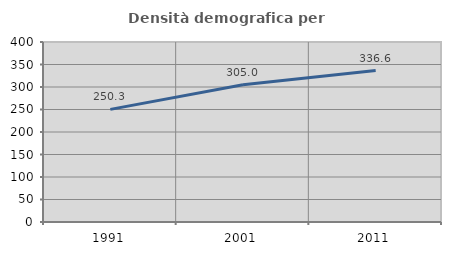
| Category | Densità demografica |
|---|---|
| 1991.0 | 250.331 |
| 2001.0 | 304.952 |
| 2011.0 | 336.648 |